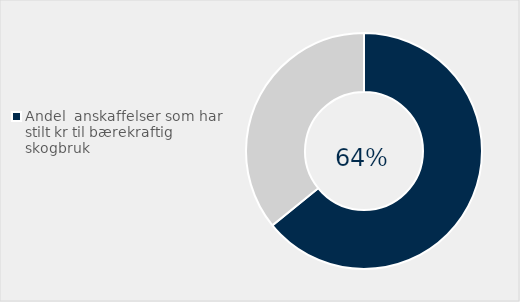
| Category | Series 0 |
|---|---|
| Andel  anskaffelser som har stilt kr til bærekraftig skogbruk | 0.642 |
| Ikke stilt krav til bærekraftig skogbruk | 0.358 |